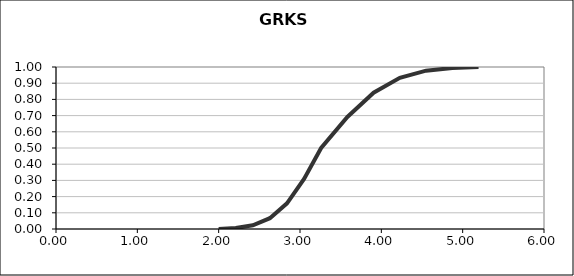
| Category | Series 0 |
|---|---|
| 2.0 | 0 |
| 2.209999508699153 | 0.006 |
| 2.4200003333424696 | 0.023 |
| 2.6299998691518973 | 0.067 |
| 2.839999987123821 | 0.159 |
| 3.050000007143935 | 0.309 |
| 3.26 | 0.5 |
| 3.5824999890289564 | 0.691 |
| 3.905000019774131 | 0.841 |
| 4.2275002009452995 | 0.933 |
| 4.549999488081206 | 0.977 |
| 4.872500754497728 | 0.994 |
| 5.1949999999999985 | 1 |